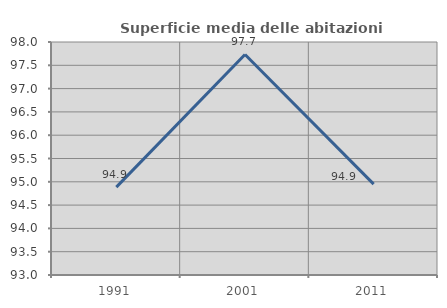
| Category | Superficie media delle abitazioni occupate |
|---|---|
| 1991.0 | 94.885 |
| 2001.0 | 97.732 |
| 2011.0 | 94.949 |